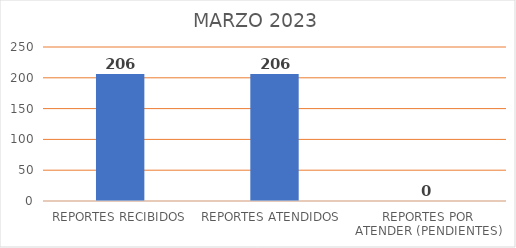
| Category | Series 0 |
|---|---|
| REPORTES RECIBIDOS | 206 |
| REPORTES ATENDIDOS  | 206 |
| REPORTES POR ATENDER (PENDIENTES) | 0 |